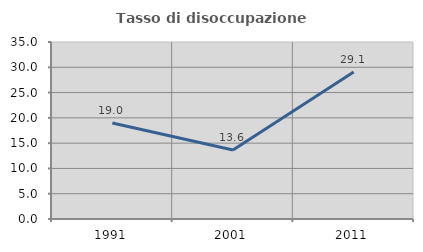
| Category | Tasso di disoccupazione giovanile  |
|---|---|
| 1991.0 | 18.996 |
| 2001.0 | 13.64 |
| 2011.0 | 29.063 |